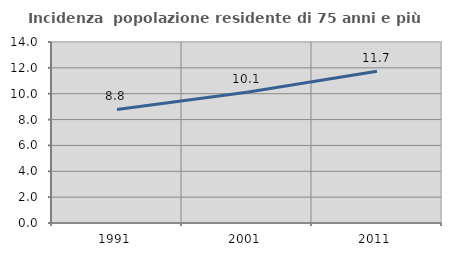
| Category | Incidenza  popolazione residente di 75 anni e più |
|---|---|
| 1991.0 | 8.784 |
| 2001.0 | 10.118 |
| 2011.0 | 11.741 |